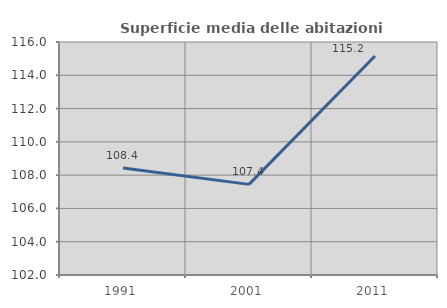
| Category | Superficie media delle abitazioni occupate |
|---|---|
| 1991.0 | 108.425 |
| 2001.0 | 107.445 |
| 2011.0 | 115.155 |